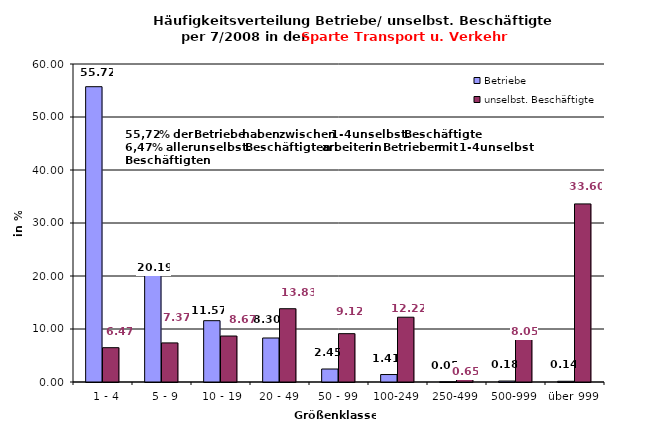
| Category | Betriebe | unselbst. Beschäftigte |
|---|---|---|
|   1 - 4 | 55.717 | 6.475 |
|   5 - 9 | 20.191 | 7.375 |
|  10 - 19 | 11.57 | 8.675 |
| 20 - 49 | 8.303 | 13.829 |
| 50 - 99 | 2.45 | 9.12 |
| 100-249 | 1.407 | 12.223 |
| 250-499 | 0.045 | 0.65 |
| 500-999 | 0.181 | 8.053 |
| über 999 | 0.136 | 33.6 |